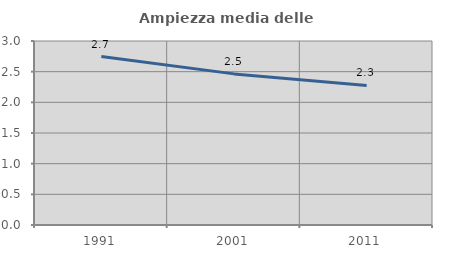
| Category | Ampiezza media delle famiglie |
|---|---|
| 1991.0 | 2.746 |
| 2001.0 | 2.464 |
| 2011.0 | 2.275 |